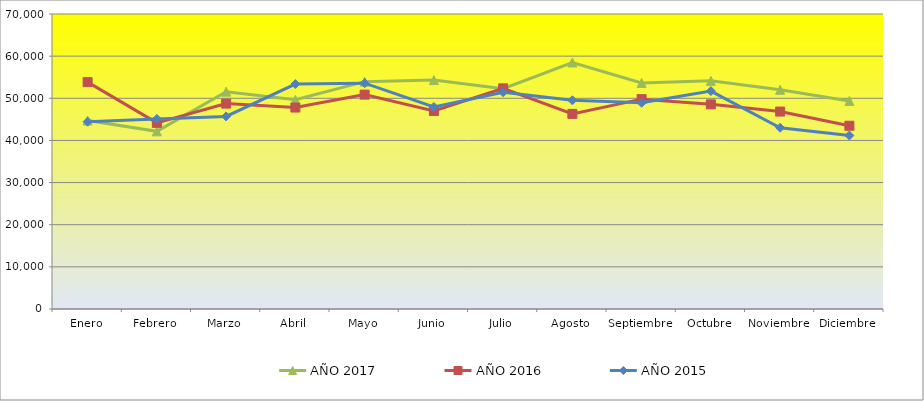
| Category | AÑO 2017 | AÑO 2016 | AÑO 2015 |
|---|---|---|---|
| Enero | 44723.506 | 53841 | 44441 |
| Febrero | 42153.247 | 44168 | 45109 |
| Marzo | 51566.104 | 48741 | 45703 |
| Abril | 49649.091 | 47802 | 53371 |
| Mayo | 53947.273 | 50869 | 53585 |
| Junio | 54330 | 46981 | 47937 |
| Julio | 52267.922 | 52359 | 51441 |
| Agosto | 58494.416 | 46295 | 49525 |
| Septiembre | 53655.065 | 49798 | 48943 |
| Octubre | 54139.574 | 48561 | 51702 |
| Noviembre | 52020.965 | 46849 | 43015 |
| Diciembre | 49377.403 | 43484 | 41174 |